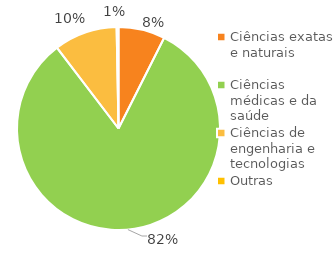
| Category | Series 0 |
|---|---|
| Ciências exatas e naturais | 8.97 |
| Ciências médicas e da saúde | 99.4 |
| Ciências de engenharia e tecnologias | 12.169 |
| Outras | 0.361 |